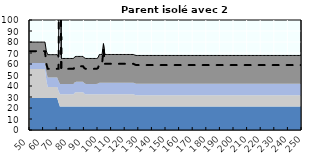
| Category | Coin fiscal marginal (somme des composantes) | Taux d’imposition marginal net |
|---|---|---|
| 50.0 | 79.927 | 71.687 |
| 51.0 | 79.927 | 71.687 |
| 52.0 | 79.927 | 71.687 |
| 53.0 | 79.927 | 71.687 |
| 54.0 | 79.927 | 71.687 |
| 55.0 | 79.927 | 71.687 |
| 56.0 | 79.927 | 71.687 |
| 57.0 | 79.927 | 71.687 |
| 58.0 | 79.927 | 71.687 |
| 59.0 | 79.927 | 71.687 |
| 60.0 | 79.927 | 71.687 |
| 61.0 | 79.927 | 71.687 |
| 62.0 | 71.871 | 60.325 |
| 63.0 | 68.504 | 55.575 |
| 64.0 | 68.504 | 55.575 |
| 65.0 | 68.504 | 55.575 |
| 66.0 | 68.504 | 55.575 |
| 67.0 | 68.504 | 55.575 |
| 68.0 | 68.504 | 55.575 |
| 69.0 | 68.504 | 55.575 |
| 70.0 | 68.504 | 55.575 |
| 71.0 | 66.593 | 55.575 |
| 72.0 | 270.395 | 316.483 |
| 73.0 | 65.033 | 55.575 |
| 74.0 | 65.033 | 55.575 |
| 75.0 | 65.033 | 55.575 |
| 76.0 | 65.033 | 55.575 |
| 77.0 | 65.033 | 55.575 |
| 78.0 | 65.033 | 55.575 |
| 79.0 | 65.033 | 55.575 |
| 80.0 | 65.033 | 55.575 |
| 81.0 | 65.033 | 55.575 |
| 82.0 | 65.033 | 55.575 |
| 83.0 | 66.568 | 57.526 |
| 84.0 | 66.887 | 57.93 |
| 85.0 | 66.887 | 57.93 |
| 86.0 | 66.887 | 57.93 |
| 87.0 | 66.887 | 57.93 |
| 88.0 | 66.887 | 57.93 |
| 89.0 | 66.887 | 57.93 |
| 90.0 | 65.516 | 56.188 |
| 91.0 | 65.033 | 55.575 |
| 92.0 | 65.033 | 55.575 |
| 93.0 | 65.033 | 55.575 |
| 94.0 | 65.033 | 55.575 |
| 95.0 | 65.033 | 55.575 |
| 96.0 | 65.033 | 55.575 |
| 97.0 | 65.033 | 55.575 |
| 98.0 | 65.033 | 55.575 |
| 99.0 | 65.033 | 55.575 |
| 100.0 | 65.679 | 56.396 |
| 101.0 | 68.651 | 60.172 |
| 102.0 | 68.651 | 60.172 |
| 103.0 | 68.651 | 60.172 |
| 104.0 | 78.524 | 72.715 |
| 105.0 | 68.651 | 60.172 |
| 106.0 | 68.651 | 60.172 |
| 107.0 | 68.651 | 60.172 |
| 108.0 | 68.651 | 60.172 |
| 109.0 | 68.651 | 60.172 |
| 110.0 | 68.651 | 60.172 |
| 111.0 | 68.651 | 60.172 |
| 112.0 | 68.651 | 60.172 |
| 113.0 | 68.651 | 60.172 |
| 114.0 | 68.651 | 60.172 |
| 115.0 | 68.651 | 60.172 |
| 116.0 | 68.651 | 60.172 |
| 117.0 | 68.651 | 60.172 |
| 118.0 | 68.651 | 60.172 |
| 119.0 | 68.651 | 60.172 |
| 120.0 | 68.651 | 60.172 |
| 121.0 | 68.651 | 60.172 |
| 122.0 | 68.651 | 60.172 |
| 123.0 | 68.651 | 60.172 |
| 124.0 | 68.651 | 60.172 |
| 125.0 | 68.651 | 60.172 |
| 126.0 | 68.651 | 60.172 |
| 127.0 | 68.159 | 59.547 |
| 128.0 | 67.762 | 59.042 |
| 129.0 | 67.762 | 59.042 |
| 130.0 | 67.762 | 59.042 |
| 131.0 | 67.762 | 59.042 |
| 132.0 | 67.762 | 59.042 |
| 133.0 | 67.762 | 59.042 |
| 134.0 | 67.762 | 59.042 |
| 135.0 | 67.762 | 59.042 |
| 136.0 | 67.762 | 59.042 |
| 137.0 | 67.762 | 59.042 |
| 138.0 | 67.762 | 59.042 |
| 139.0 | 67.762 | 59.042 |
| 140.0 | 67.762 | 59.042 |
| 141.0 | 67.762 | 59.042 |
| 142.0 | 67.762 | 59.042 |
| 143.0 | 67.762 | 59.042 |
| 144.0 | 67.762 | 59.042 |
| 145.0 | 67.762 | 59.042 |
| 146.0 | 67.762 | 59.042 |
| 147.0 | 67.762 | 59.042 |
| 148.0 | 67.762 | 59.042 |
| 149.0 | 67.762 | 59.042 |
| 150.0 | 67.762 | 59.042 |
| 151.0 | 67.762 | 59.042 |
| 152.0 | 67.762 | 59.042 |
| 153.0 | 67.762 | 59.042 |
| 154.0 | 67.762 | 59.042 |
| 155.0 | 67.762 | 59.042 |
| 156.0 | 67.762 | 59.042 |
| 157.0 | 67.762 | 59.042 |
| 158.0 | 67.762 | 59.042 |
| 159.0 | 67.762 | 59.042 |
| 160.0 | 67.762 | 59.042 |
| 161.0 | 67.762 | 59.042 |
| 162.0 | 67.762 | 59.042 |
| 163.0 | 67.762 | 59.042 |
| 164.0 | 67.762 | 59.042 |
| 165.0 | 67.762 | 59.042 |
| 166.0 | 67.762 | 59.042 |
| 167.0 | 67.762 | 59.042 |
| 168.0 | 67.762 | 59.042 |
| 169.0 | 67.762 | 59.042 |
| 170.0 | 67.762 | 59.042 |
| 171.0 | 67.762 | 59.042 |
| 172.0 | 67.762 | 59.042 |
| 173.0 | 67.762 | 59.042 |
| 174.0 | 67.762 | 59.042 |
| 175.0 | 67.762 | 59.042 |
| 176.0 | 67.762 | 59.042 |
| 177.0 | 67.762 | 59.042 |
| 178.0 | 67.762 | 59.042 |
| 179.0 | 67.762 | 59.042 |
| 180.0 | 67.762 | 59.042 |
| 181.0 | 67.762 | 59.042 |
| 182.0 | 67.762 | 59.042 |
| 183.0 | 67.762 | 59.042 |
| 184.0 | 67.762 | 59.042 |
| 185.0 | 67.762 | 59.042 |
| 186.0 | 67.762 | 59.042 |
| 187.0 | 67.762 | 59.042 |
| 188.0 | 67.762 | 59.042 |
| 189.0 | 67.762 | 59.042 |
| 190.0 | 67.762 | 59.042 |
| 191.0 | 67.762 | 59.042 |
| 192.0 | 67.762 | 59.042 |
| 193.0 | 67.762 | 59.042 |
| 194.0 | 67.762 | 59.042 |
| 195.0 | 67.762 | 59.042 |
| 196.0 | 67.762 | 59.042 |
| 197.0 | 67.762 | 59.042 |
| 198.0 | 67.762 | 59.042 |
| 199.0 | 67.762 | 59.042 |
| 200.0 | 67.762 | 59.042 |
| 201.0 | 67.762 | 59.042 |
| 202.0 | 67.762 | 59.042 |
| 203.0 | 67.762 | 59.042 |
| 204.0 | 67.762 | 59.042 |
| 205.0 | 67.762 | 59.042 |
| 206.0 | 67.762 | 59.042 |
| 207.0 | 67.762 | 59.042 |
| 208.0 | 67.762 | 59.042 |
| 209.0 | 67.762 | 59.042 |
| 210.0 | 67.762 | 59.042 |
| 211.0 | 67.762 | 59.042 |
| 212.0 | 67.762 | 59.042 |
| 213.0 | 67.762 | 59.042 |
| 214.0 | 67.762 | 59.042 |
| 215.0 | 67.762 | 59.042 |
| 216.0 | 67.762 | 59.042 |
| 217.0 | 67.762 | 59.042 |
| 218.0 | 67.762 | 59.042 |
| 219.0 | 67.762 | 59.042 |
| 220.0 | 67.762 | 59.042 |
| 221.0 | 67.762 | 59.042 |
| 222.0 | 67.762 | 59.042 |
| 223.0 | 67.762 | 59.042 |
| 224.0 | 67.762 | 59.042 |
| 225.0 | 67.762 | 59.042 |
| 226.0 | 67.762 | 59.042 |
| 227.0 | 67.762 | 59.042 |
| 228.0 | 67.762 | 59.042 |
| 229.0 | 67.762 | 59.042 |
| 230.0 | 67.762 | 59.042 |
| 231.0 | 67.762 | 59.042 |
| 232.0 | 67.762 | 59.042 |
| 233.0 | 67.762 | 59.042 |
| 234.0 | 67.762 | 59.042 |
| 235.0 | 67.762 | 59.042 |
| 236.0 | 67.762 | 59.042 |
| 237.0 | 67.762 | 59.042 |
| 238.0 | 67.762 | 59.042 |
| 239.0 | 67.762 | 59.042 |
| 240.0 | 67.762 | 59.042 |
| 241.0 | 67.762 | 59.042 |
| 242.0 | 67.762 | 59.042 |
| 243.0 | 67.762 | 59.042 |
| 244.0 | 67.762 | 59.042 |
| 245.0 | 67.762 | 59.042 |
| 246.0 | 67.762 | 59.042 |
| 247.0 | 67.762 | 59.042 |
| 248.0 | 67.762 | 59.042 |
| 249.0 | 67.762 | 59.042 |
| 250.0 | 67.762 | 59.042 |